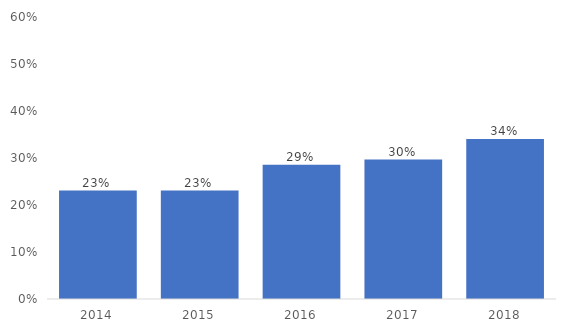
| Category | Share of board heads who are women |
|---|---|
| 2014.0 | 0.231 |
| 2015.0 | 0.231 |
| 2016.0 | 0.286 |
| 2017.0 | 0.297 |
| 2018.0 | 0.341 |